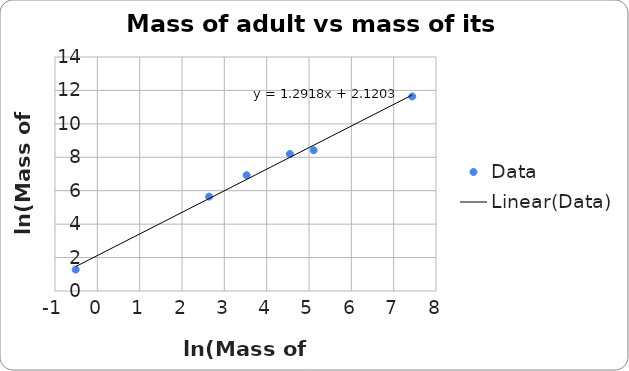
| Category | Data |
|---|---|
| 7.43838353 | 11.639 |
| 5.108366783 | 8.42 |
| 4.548599834 | 8.197 |
| 3.526360525 | 6.928 |
| 2.63905733 | 5.645 |
| -0.510825624 | 1.281 |